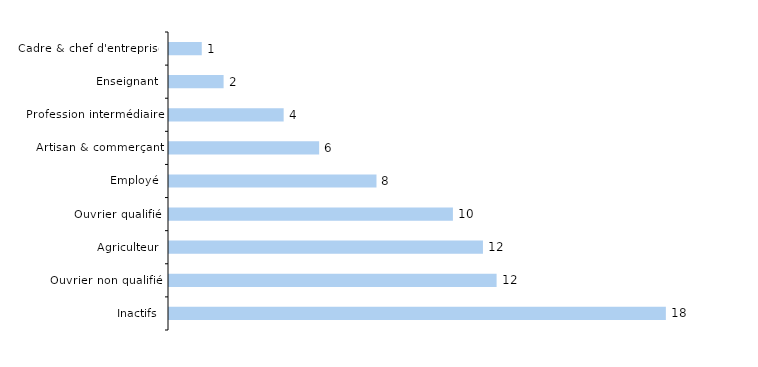
| Category | Series 1 |
|---|---|
| Inactifs | 18.2 |
| Ouvrier non qualifié | 12 |
| Agriculteur | 11.5 |
| Ouvrier qualifié | 10.4 |
| Employé | 7.6 |
| Artisan & commerçant | 5.5 |
| Profession intermédiaire | 4.2 |
| Enseignant | 2 |
| Cadre & chef d'entreprise | 1.2 |